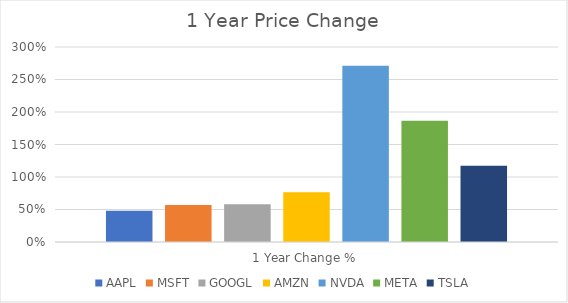
| Category | AAPL | MSFT | GOOGL | AMZN | NVDA | META | TSLA |
|---|---|---|---|---|---|---|---|
| 1 Year Change % | 0.48 | 0.569 | 0.582 | 0.764 | 2.712 | 1.865 | 1.174 |